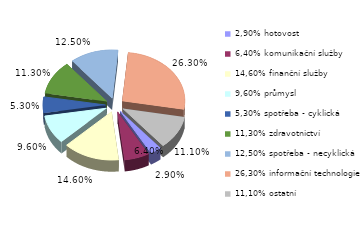
| Category | Series 0 |
|---|---|
| 2,90% hotovost | 0.029 |
| 6,40% komunikační služby | 0.064 |
| 14,60% finanční služby | 0.146 |
| 9,60% průmysl | 0.096 |
| 5,30% spotřeba - cyklická | 0.053 |
| 11,30% zdravotnictví | 0.113 |
| 12,50% spotřeba - necyklická | 0.125 |
| 26,30% informační technologie | 0.263 |
| 11,10% ostatní | 0.111 |